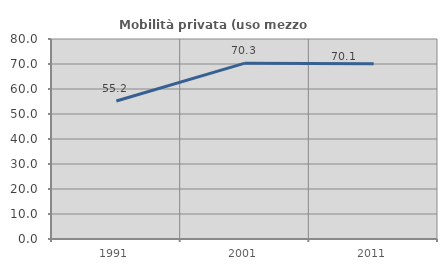
| Category | Mobilità privata (uso mezzo privato) |
|---|---|
| 1991.0 | 55.186 |
| 2001.0 | 70.328 |
| 2011.0 | 70.088 |